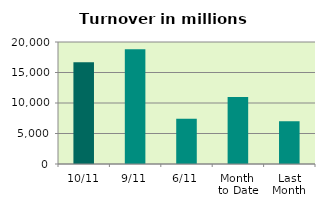
| Category | Series 0 |
|---|---|
| 10/11 | 16700.365 |
| 9/11 | 18829.504 |
| 6/11 | 7411.731 |
| Month 
to Date | 11002.925 |
| Last
Month | 7023.861 |